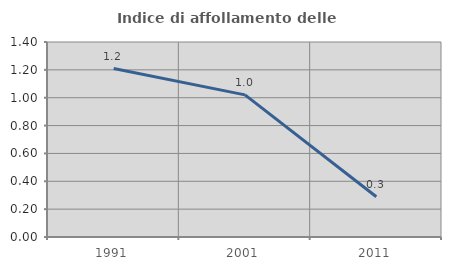
| Category | Indice di affollamento delle abitazioni  |
|---|---|
| 1991.0 | 1.21 |
| 2001.0 | 1.02 |
| 2011.0 | 0.289 |